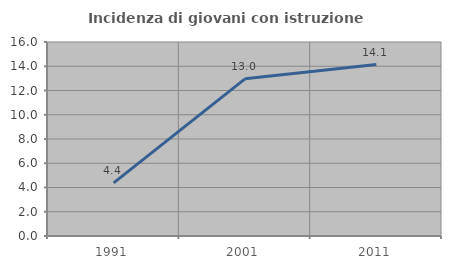
| Category | Incidenza di giovani con istruzione universitaria |
|---|---|
| 1991.0 | 4.386 |
| 2001.0 | 12.963 |
| 2011.0 | 14.141 |